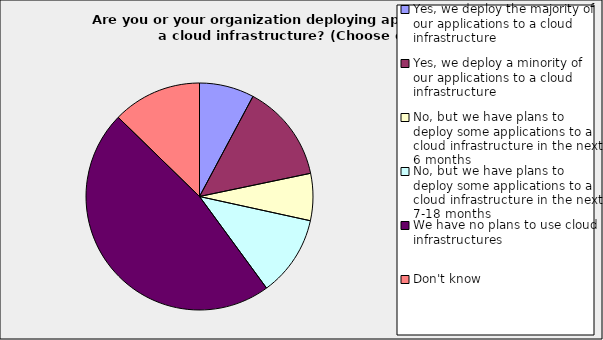
| Category | Series 0 |
|---|---|
| Yes, we deploy the majority of our applications to a cloud infrastructure | 0.078 |
| Yes, we deploy a minority of our applications to a cloud infrastructure | 0.139 |
| No, but we have plans to deploy some applications to a cloud infrastructure in the next 6 months | 0.067 |
| No, but we have plans to deploy some applications to a cloud infrastructure in the next 7-18 months | 0.115 |
| We have no plans to use cloud infrastructures | 0.473 |
| Don't know | 0.127 |